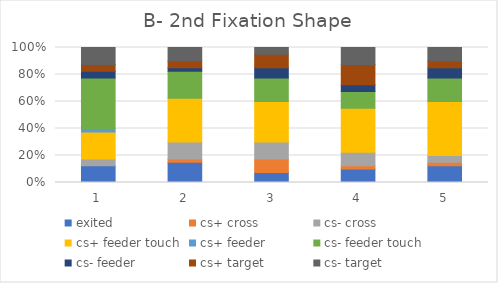
| Category | exited | cs+ cross | cs- cross | cs+ feeder touch | cs+ feeder | cs- feeder touch | cs- feeder | cs+ target | cs- target |
|---|---|---|---|---|---|---|---|---|---|
| 0 | 5 | 0 | 2 | 8 | 1 | 15 | 2 | 2 | 5 |
| 1 | 6 | 1 | 5 | 13 | 0 | 8 | 1 | 2 | 4 |
| 2 | 3 | 4 | 5 | 12 | 0 | 7 | 3 | 4 | 2 |
| 3 | 4 | 1 | 4 | 13 | 0 | 5 | 2 | 6 | 5 |
| 4 | 5 | 1 | 2 | 16 | 0 | 7 | 3 | 2 | 4 |